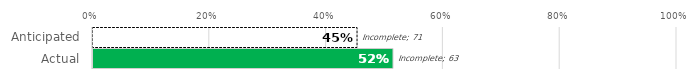
| Category | Complete | Incomplete |
|---|---|---|
| Anticipated | 59 | 71 |
| Actual | 67 | 63 |